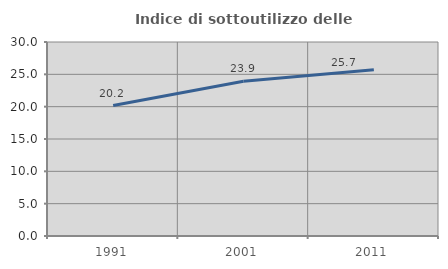
| Category | Indice di sottoutilizzo delle abitazioni  |
|---|---|
| 1991.0 | 20.167 |
| 2001.0 | 23.921 |
| 2011.0 | 25.71 |